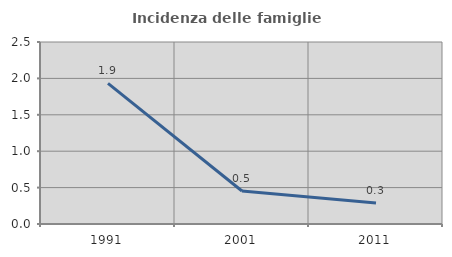
| Category | Incidenza delle famiglie numerose |
|---|---|
| 1991.0 | 1.932 |
| 2001.0 | 0.453 |
| 2011.0 | 0.289 |